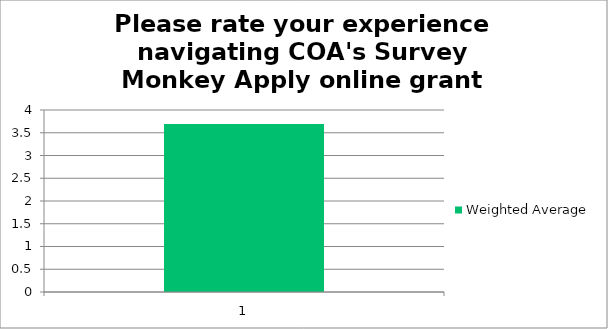
| Category | Weighted Average |
|---|---|
| 1.0 | 3.69 |